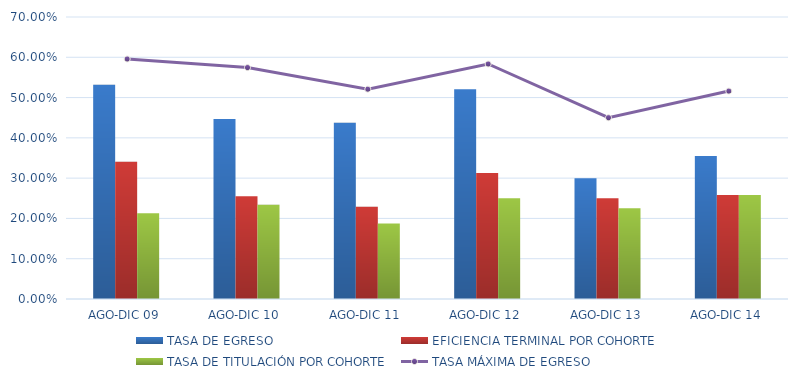
| Category | TASA DE EGRESO | EFICIENCIA TERMINAL POR COHORTE | TASA DE TITULACIÓN POR COHORTE |
|---|---|---|---|
| AGO-DIC 09 | 0.532 | 0.34 | 0.213 |
| AGO-DIC 10 | 0.447 | 0.255 | 0.234 |
| AGO-DIC 11 | 0.438 | 0.229 | 0.188 |
| AGO-DIC 12 | 0.521 | 0.312 | 0.25 |
| AGO-DIC 13 | 0.3 | 0.25 | 0.225 |
| AGO-DIC 14 | 0.355 | 0.258 | 0.258 |